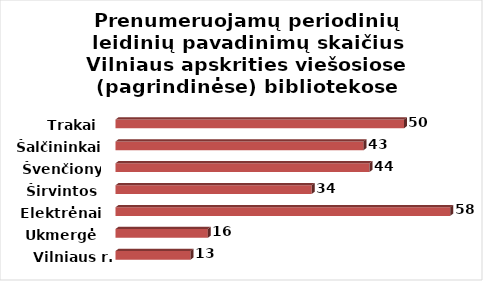
| Category | Series 0 |
|---|---|
| Vilniaus r. | 13 |
| Ukmergė | 16 |
| Elektrėnai | 58 |
| Širvintos | 34 |
| Švenčionys | 44 |
| Šalčininkai | 43 |
| Trakai | 50 |